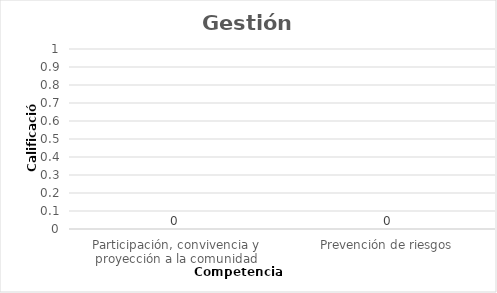
| Category | Series 0 |
|---|---|
| Participación, convivencia y proyección a la comunidad | 0 |
| Prevención de riesgos | 0 |